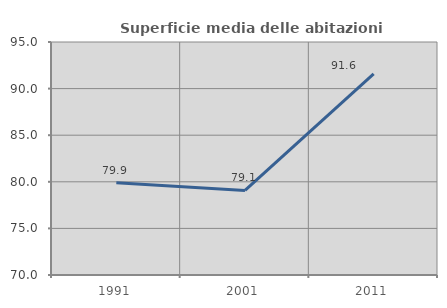
| Category | Superficie media delle abitazioni occupate |
|---|---|
| 1991.0 | 79.886 |
| 2001.0 | 79.074 |
| 2011.0 | 91.573 |